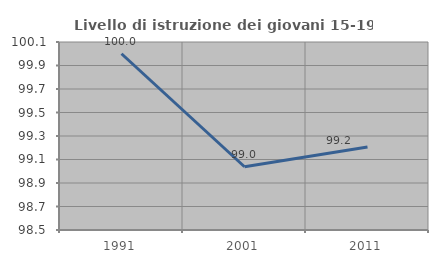
| Category | Livello di istruzione dei giovani 15-19 anni |
|---|---|
| 1991.0 | 100 |
| 2001.0 | 99.038 |
| 2011.0 | 99.206 |